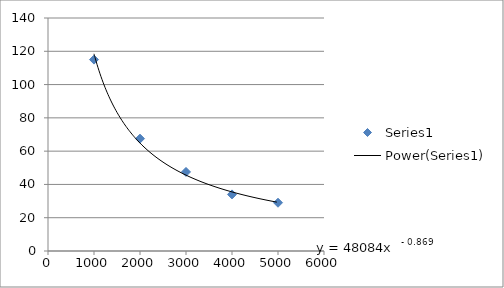
| Category | Series 0 |
|---|---|
| 1000.0 | 115 |
| 2000.0 | 67.5 |
| 3000.0 | 47.5 |
| 4000.0 | 34 |
| 5000.0 | 29 |